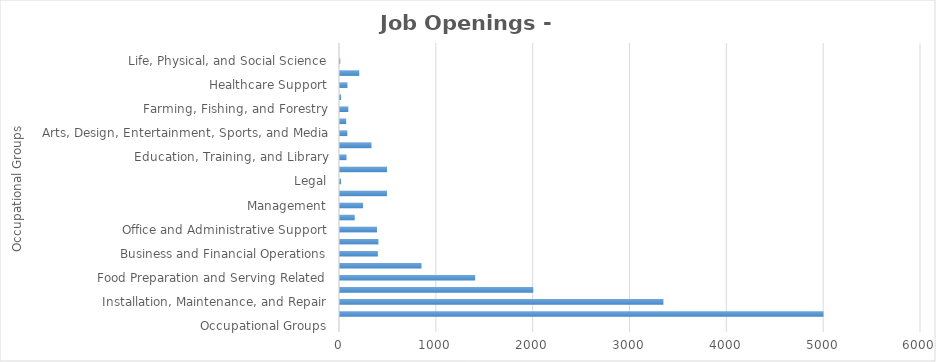
| Category | Series1 |
|---|---|
| Occupational Groups | 0 |
| Construction and Extraction | 4993 |
| Installation, Maintenance, and Repair | 3340 |
| Building and Grounds Cleaning and Maintenance | 1996 |
| Food Preparation and Serving Related | 1396 |
| Personal Care and Service | 842 |
| Business and Financial Operations | 391 |
| Sales and Related | 397 |
| Office and Administrative Support | 382 |
| Architecture and Engineering | 152 |
| Management | 238 |
| Transportation and Material Moving | 485 |
| Legal | 11 |
| Healthcare Practitioners and Technical | 486 |
| Education, Training, and Library | 67 |
| Production | 325 |
| Arts, Design, Entertainment, Sports, and Media | 76 |
| Computer and Mathematical | 64 |
| Farming, Fishing, and Forestry | 86 |
| Community and Social Services | 11 |
| Healthcare Support | 77 |
| Protective Service | 199 |
| Life, Physical, and Social Science | 3 |
| Military Specific  | 0 |